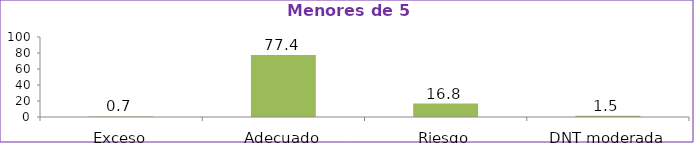
| Category | Series 0 |
|---|---|
| Exceso | 0.7 |
| Adecuado | 77.4 |
| Riesgo | 16.8 |
| DNT moderada | 1.5 |